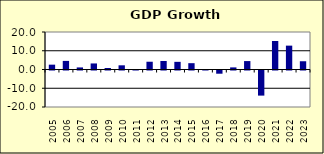
| Category | 9.3 |
|---|---|
| 2005.0 | 2.579 |
| 2006.0 | 4.583 |
| 2007.0 | 1.104 |
| 2008.0 | 3.228 |
| 2009.0 | 0.799 |
| 2010.0 | 2.234 |
| 2011.0 | 0.188 |
| 2012.0 | 4.142 |
| 2013.0 | 4.534 |
| 2014.0 | 4.088 |
| 2015.0 | 3.371 |
| 2016.0 | 0.12 |
| 2017.0 | -1.712 |
| 2018.0 | 1.123 |
| 2019.0 | 4.492 |
| 2020.0 | -13.392 |
| 2021.0 | 15.208 |
| 2022.0 | 12.726 |
| 2023.0 | 4.4 |